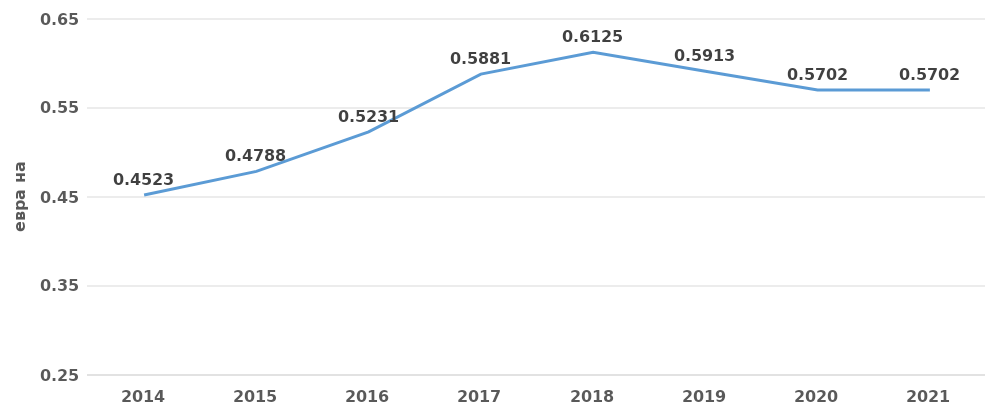
| Category | Продуктивност на ресурси |
|---|---|
| 2014.0 | 0.452 |
| 2015.0 | 0.479 |
| 2016.0 | 0.523 |
| 2017.0 | 0.588 |
| 2018.0 | 0.612 |
| 2019.0 | 0.591 |
| 2020.0 | 0.57 |
| 2021.0 | 0.57 |